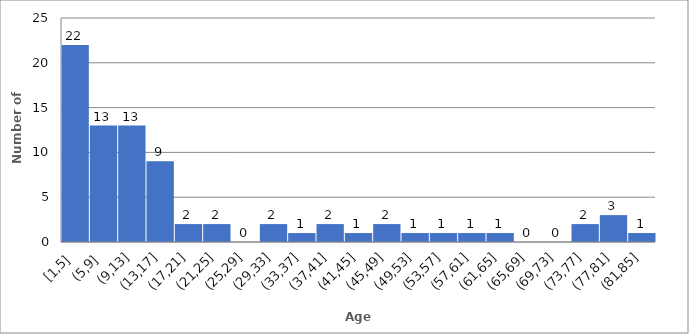
| Category | Count |
|---|---|
| Alpha Hemolytic Streptococcus | 5 |
| Arcanobacterium haemolyticum | 1 |
| Beta Hemolytic Streptococcus | 2 |
| Coryneform bacili | 1 |
| Eikenella corrodens | 2 |
| Fusobacterium nucleatum | 1 |
| Group A Streptococcus | 1 |
| Haemophilus influenza | 6 |
| Morganella morganii | 2 |
| Parvimonas micra | 2 |
| Prevotella spp. | 4 |
| Pseudomonas aeruginosa | 1 |
| Streptococcus anginosus | 9 |
| Staphylococcus aureus | 9 |
| Streptococcus intermedius | 1 |
| Staphylococcus lugdunensis | 1 |
| Streptococcus pneumoniae | 7 |
| Streptococcus pyogenes | 3 |